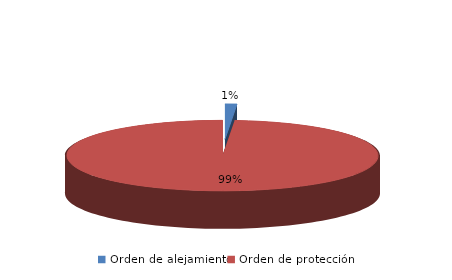
| Category | Series 0 |
|---|---|
| Orden de alejamiento | 6 |
| Orden de protección | 485 |